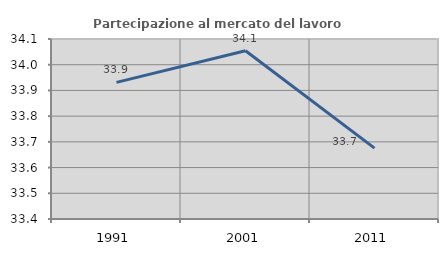
| Category | Partecipazione al mercato del lavoro  femminile |
|---|---|
| 1991.0 | 33.931 |
| 2001.0 | 34.054 |
| 2011.0 | 33.676 |